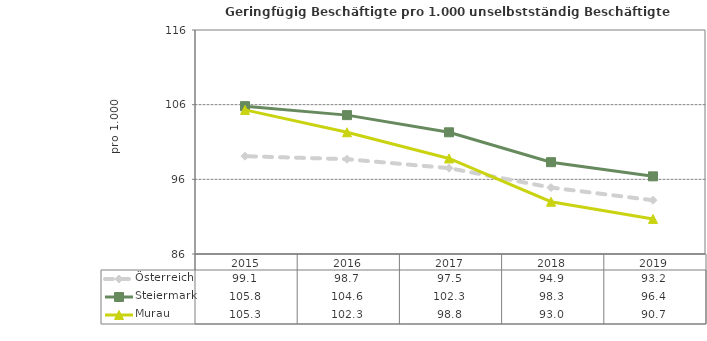
| Category | Österreich | Steiermark | Murau |
|---|---|---|---|
| 2019.0 | 93.2 | 96.4 | 90.7 |
| 2018.0 | 94.9 | 98.3 | 93 |
| 2017.0 | 97.5 | 102.3 | 98.8 |
| 2016.0 | 98.7 | 104.6 | 102.3 |
| 2015.0 | 99.1 | 105.8 | 105.3 |